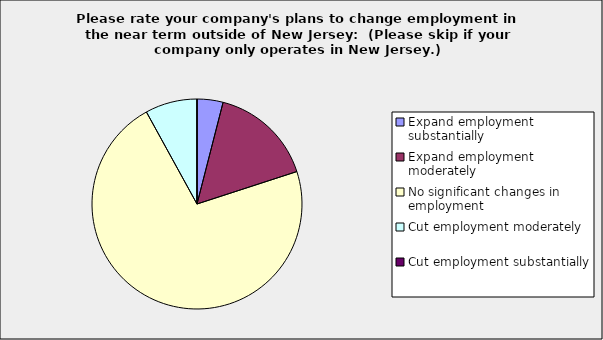
| Category | Series 0 |
|---|---|
| Expand employment substantially | 0.04 |
| Expand employment moderately | 0.16 |
| No significant changes in employment | 0.72 |
| Cut employment moderately | 0.08 |
| Cut employment substantially | 0 |